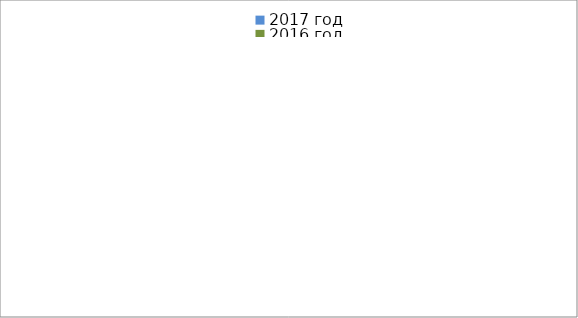
| Category | 2017 год | 2016 год |
|---|---|---|
|  - поджог | 3 | 20 |
|  - неосторожное обращение с огнём | 1 | 13 |
|  - НПТЭ электрооборудования | 4 | 2 |
|  - НПУ и Э печей | 15 | 16 |
|  - НПУ и Э транспортных средств | 21 | 9 |
|   -Шалость с огнем детей | 1 | 3 |
|  -НППБ при эксплуатации эл.приборов | 13 | 3 |
|  - курение | 13 | 2 |
| - прочие | 28 | 35 |
| - не установленные причины | 0 | 10 |